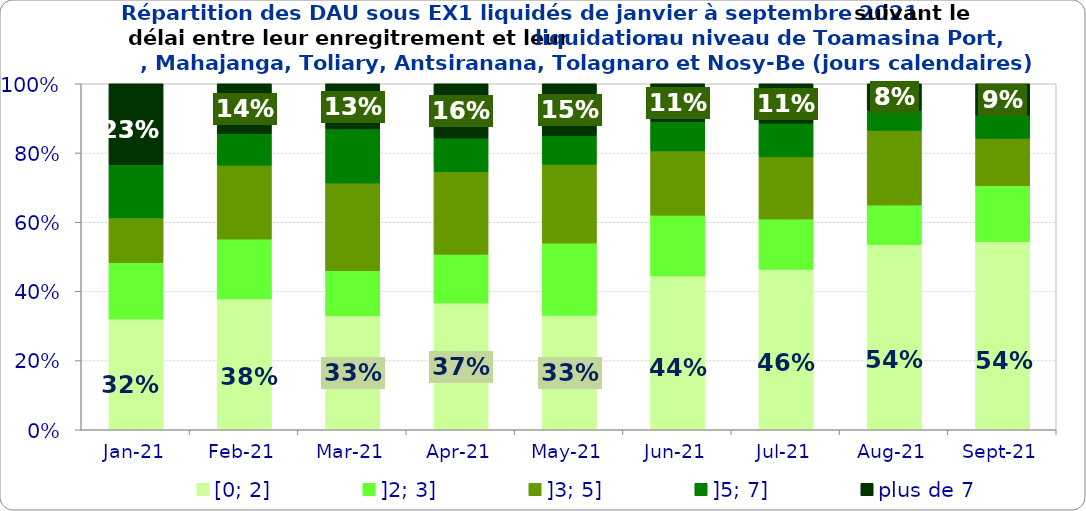
| Category | [0; 2] | ]2; 3] | ]3; 5] | ]5; 7] | plus de 7 |
|---|---|---|---|---|---|
| 2021-01-01 | 0.32 | 0.163 | 0.129 | 0.154 | 0.234 |
| 2021-02-01 | 0.378 | 0.173 | 0.214 | 0.091 | 0.144 |
| 2021-03-01 | 0.329 | 0.13 | 0.253 | 0.157 | 0.13 |
| 2021-04-01 | 0.367 | 0.141 | 0.238 | 0.097 | 0.157 |
| 2021-05-01 | 0.331 | 0.209 | 0.228 | 0.083 | 0.15 |
| 2021-06-01 | 0.444 | 0.176 | 0.186 | 0.085 | 0.109 |
| 2021-07-01 | 0.464 | 0.145 | 0.18 | 0.097 | 0.114 |
| 2021-08-01 | 0.535 | 0.114 | 0.216 | 0.057 | 0.077 |
| 2021-09-01 | 0.544 | 0.161 | 0.137 | 0.067 | 0.091 |